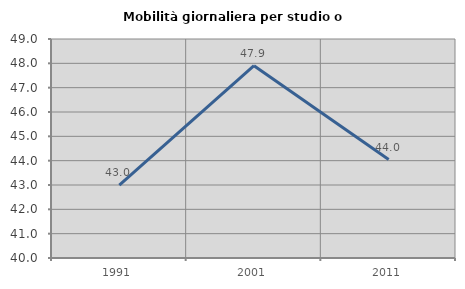
| Category | Mobilità giornaliera per studio o lavoro |
|---|---|
| 1991.0 | 42.995 |
| 2001.0 | 47.904 |
| 2011.0 | 44.048 |